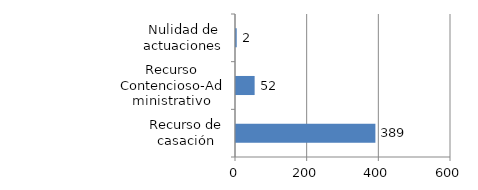
| Category | Series 0 |
|---|---|
| Recurso de casación | 389 |
| Recurso Contencioso-Administrativo | 52 |
| Nulidad de actuaciones | 2 |